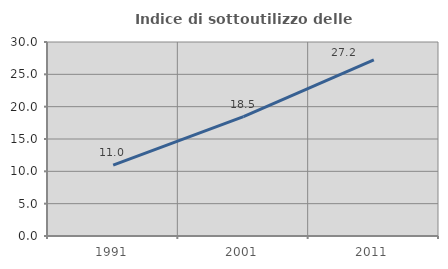
| Category | Indice di sottoutilizzo delle abitazioni  |
|---|---|
| 1991.0 | 10.95 |
| 2001.0 | 18.46 |
| 2011.0 | 27.234 |